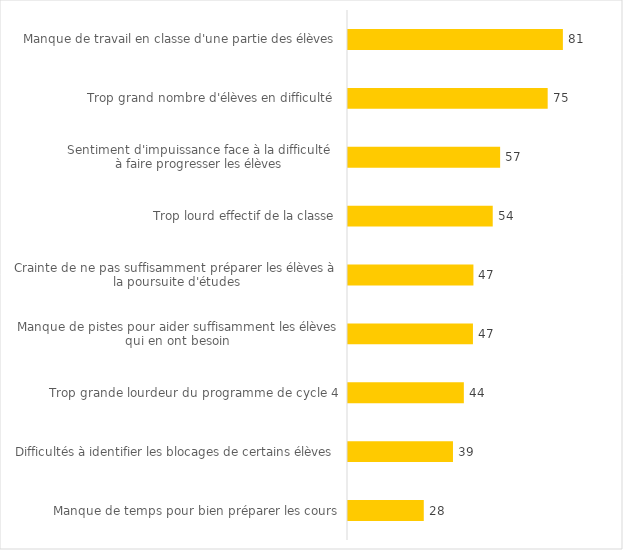
| Category | Pourcentage d'enseignants |
|---|---|
| Manque de travail en classe d'une partie des élèves | 80.782 |
| Trop grand nombre d'élèves en difficulté  | 75.066 |
| Sentiment d'impuissance face à la difficulté 
à faire progresser les élèves | 57.19 |
| Trop lourd effectif de la classe | 54.41 |
| Crainte de ne pas suffisamment préparer les élèves à la poursuite d'études | 47.15 |
| Manque de pistes pour aider suffisamment les élèves qui en ont besoin | 46.973 |
| Trop grande lourdeur du programme de cycle 4 | 43.549 |
| Difficultés à identifier les blocages de certains élèves | 39.464 |
| Manque de temps pour bien préparer les cours | 28.487 |